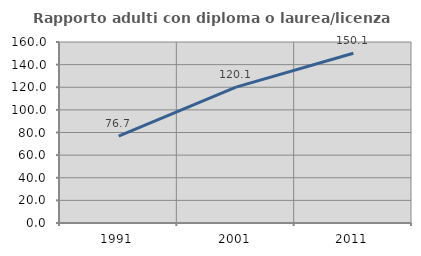
| Category | Rapporto adulti con diploma o laurea/licenza media  |
|---|---|
| 1991.0 | 76.696 |
| 2001.0 | 120.082 |
| 2011.0 | 150.095 |